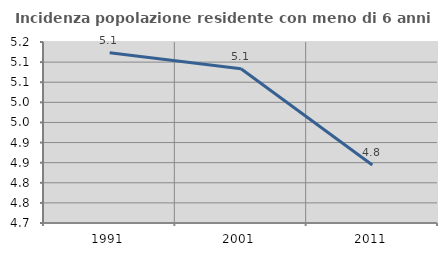
| Category | Incidenza popolazione residente con meno di 6 anni |
|---|---|
| 1991.0 | 5.123 |
| 2001.0 | 5.084 |
| 2011.0 | 4.844 |